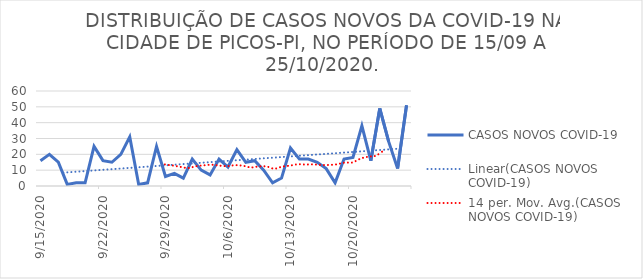
| Category | CASOS NOVOS COVID-19 |
|---|---|
| 15/09/2020 | 16 |
| 16/09/2020 | 20 |
| 17/09/2020 | 15 |
| 18/09/2020 | 1 |
| 19/09/2020 | 2 |
| 20/09/2020 | 2 |
| 21/09/2020 | 25 |
| 22/09/2020 | 16 |
| 23/09/2020 | 15 |
| 24/09/2020 | 20 |
| 25/09/2020 | 31 |
| 26/09/2020 | 1 |
| 27/09/2020 | 2 |
| 28/09/2020 | 25 |
| 29/09/2020 | 6 |
| 30/09/2020 | 8 |
| 01/10/2020 | 5 |
| 02/10/2020 | 17 |
| 03/10/2020 | 10 |
| 04/10/2020 | 7 |
| 05/10/2020 | 17 |
| 06/10/2020 | 12 |
| 07/10/2020 | 23 |
| 08/10/2020 | 15 |
| 09/10/2020 | 16 |
| 10/10/2020 | 10 |
| 11/10/2020 | 2 |
| 12/10/2020 | 5 |
| 13/10/2020 | 24 |
| 14/10/2020 | 17 |
| 15/10/2020 | 17 |
| 16/10/2020 | 15 |
| 17/10/2020 | 11 |
| 18/10/2020 | 2 |
| 19/10/2020 | 17 |
| 20/10/2020 | 18 |
| 21/10/2020 | 38 |
| 22/10/2020 | 16 |
| 23/10/2020 | 49 |
| 24/10/2020 | 28 |
| 25/10/2020 | 11 |
| 26/10/2020 | 51 |